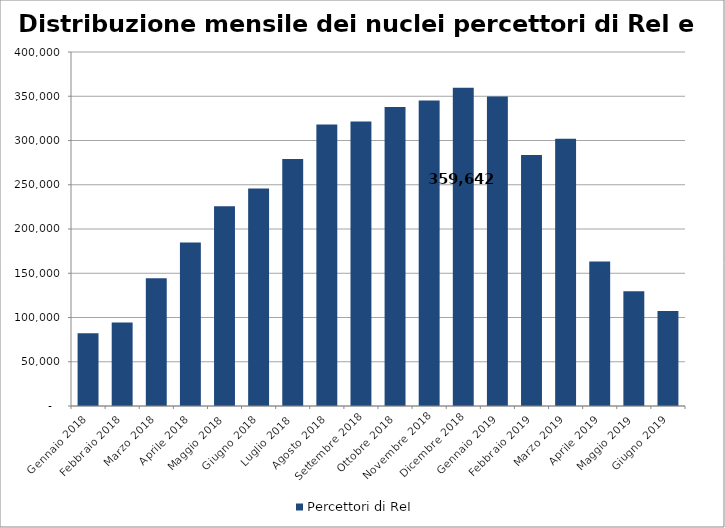
| Category | Percettori di ReI | Percettori di Rdc/Pdc |
|---|---|---|
| Gennaio 2018 | 82284 |  |
| Febbraio 2018 | 94364 |  |
| Marzo 2018 | 144329 |  |
| Aprile 2018 | 184710 |  |
| Maggio 2018 | 225705 |  |
| Giugno 2018 | 245633 |  |
| Luglio 2018 | 278967 |  |
| Agosto 2018 | 318131 |  |
| Settembre 2018 | 321502 |  |
| Ottobre 2018 | 337772 |  |
| Novembre 2018 | 345191 |  |
| Dicembre 2018 | 359642 |  |
| Gennaio 2019 | 349740 |  |
| Febbraio 2019 | 283498 |  |
| Marzo 2019 | 301928 |  |
| Aprile 2019 | 163363 |  |
| Maggio 2019 | 129648 |  |
| Giugno 2019 | 107470 |  |